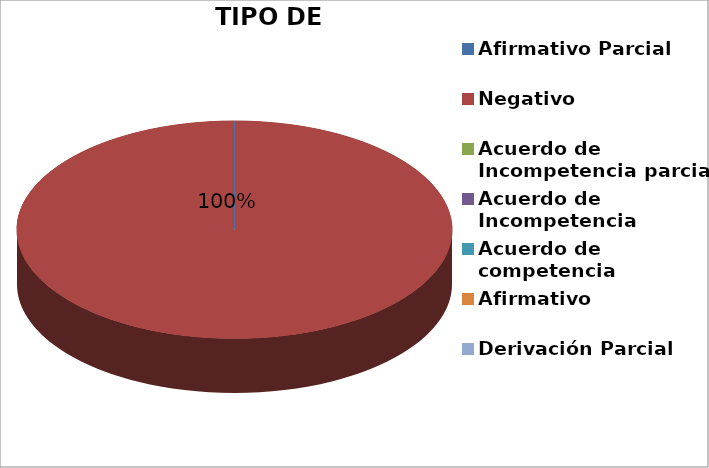
| Category | Series 0 |
|---|---|
| Afirmativo Parcial | 0 |
| Negativo | 5 |
| Acuerdo de Incompetencia parcial | 0 |
| Acuerdo de Incompetencia | 0 |
| Acuerdo de competencia | 0 |
| Afirmativo | 0 |
| Derivación Parcial | 0 |